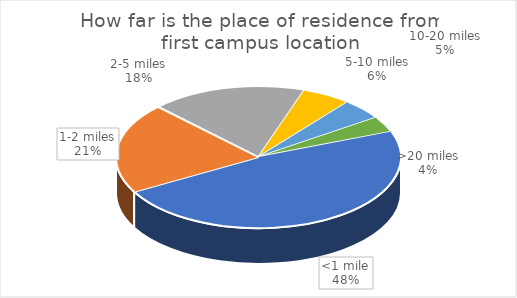
| Category | Series 0 | Series 1 |
|---|---|---|
| <1 mile | 291 | 0.477 |
| 1-2 miles | 126 | 0.207 |
| 2-5 miles | 108 | 0.177 |
| 5-10 miles | 34 | 0.056 |
| 10-20 miles | 29 | 0.048 |
| >20 miles | 22 | 0.036 |